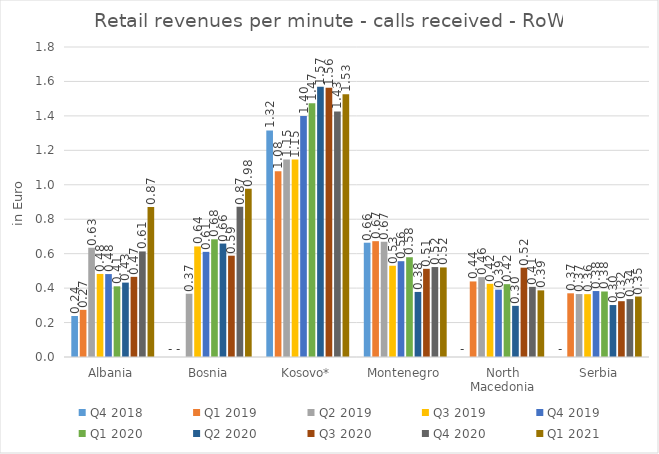
| Category | Q4 2018 | Q1 2019 | Q2 2019 | Q3 2019 | Q4 2019 | Q1 2020 | Q2 2020 | Q3 2020 | Q4 2020 | Q1 2021 |
|---|---|---|---|---|---|---|---|---|---|---|
| Albania | 0.238 | 0.274 | 0.634 | 0.482 | 0.481 | 0.41 | 0.432 | 0.465 | 0.613 | 0.871 |
| Bosnia | 0 | 0 | 0.367 | 0.642 | 0.611 | 0.683 | 0.659 | 0.588 | 0.873 | 0.977 |
| Kosovo* | 1.315 | 1.078 | 1.147 | 1.147 | 1.399 | 1.474 | 1.569 | 1.564 | 1.426 | 1.526 |
| Montenegro | 0.664 | 0.672 | 0.669 | 0.53 | 0.556 | 0.579 | 0.378 | 0.512 | 0.522 | 0.52 |
| North Macedonia | 0 | 0.439 | 0.464 | 0.425 | 0.391 | 0.423 | 0.297 | 0.518 | 0.407 | 0.387 |
| Serbia | 0 | 0.37 | 0.365 | 0.365 | 0.383 | 0.38 | 0.302 | 0.324 | 0.336 | 0.351 |